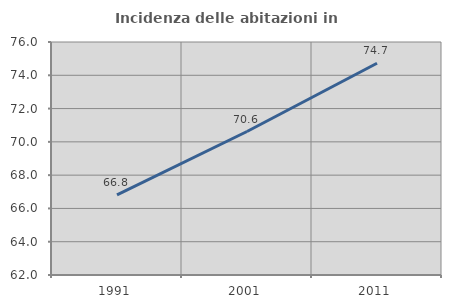
| Category | Incidenza delle abitazioni in proprietà  |
|---|---|
| 1991.0 | 66.809 |
| 2001.0 | 70.621 |
| 2011.0 | 74.723 |